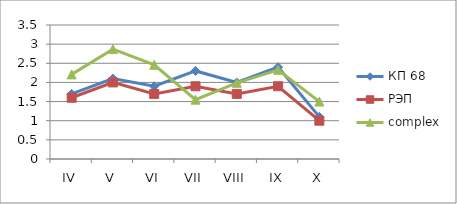
| Category | КП 68 | РЭП  | complex |
|---|---|---|---|
| IV | 1.7 | 1.6 | 2.21 |
| V | 2.1 | 2 | 2.87 |
| VI | 1.9 | 1.7 | 2.46 |
| VII | 2.3 | 1.9 | 1.55 |
| VIII | 2 | 1.7 | 1.99 |
| IX | 2.4 | 1.9 | 2.33 |
| X | 1.1 | 1 | 1.5 |